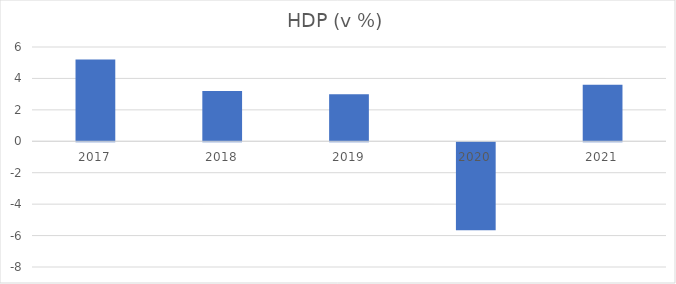
| Category | HDP (v %) |
|---|---|
| 2017.0 | 5.2 |
| 2018.0 | 3.2 |
| 2019.0 | 3 |
| 2020.0 | -5.6 |
| 2021.0 | 3.6 |